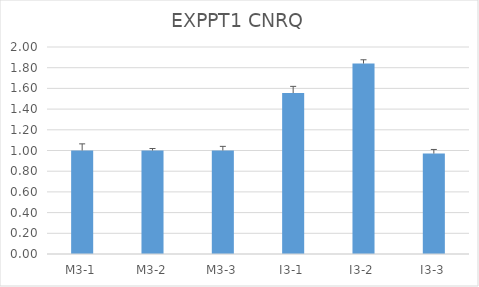
| Category | EXPPT1 CNRQ |
|---|---|
| M3-1 | 1 |
| M3-2 | 1 |
| M3-3 | 1 |
| I3-1 | 1.555 |
| I3-2 | 1.84 |
| I3-3 | 0.97 |